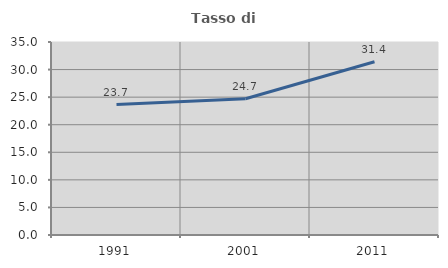
| Category | Tasso di occupazione   |
|---|---|
| 1991.0 | 23.656 |
| 2001.0 | 24.715 |
| 2011.0 | 31.408 |